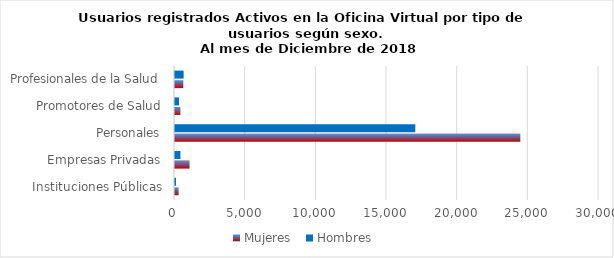
| Category | Mujeres | Hombres |
|---|---|---|
| Instituciones Públicas | 256 | 69 |
| Empresas Privadas | 1028 | 385 |
| Personales | 24433 | 17002 |
| Promotores de Salud | 382 | 282 |
| Profesionales de la Salud | 587 | 611 |